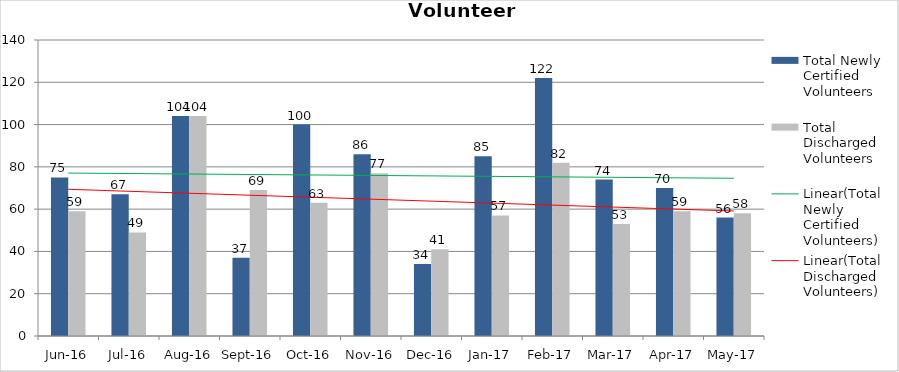
| Category | Total Newly Certified Volunteers | Total Discharged Volunteers |
|---|---|---|
| Jun-16 | 75 | 59 |
| Jul-16 | 67 | 49 |
| Aug-16 | 104 | 104 |
| Sep-16 | 37 | 69 |
| Oct-16 | 100 | 63 |
| Nov-16 | 86 | 77 |
| Dec-16 | 34 | 41 |
| Jan-17 | 85 | 57 |
| Feb-17 | 122 | 82 |
| Mar-17 | 74 | 53 |
| Apr-17 | 70 | 59 |
| May-17 | 56 | 58 |